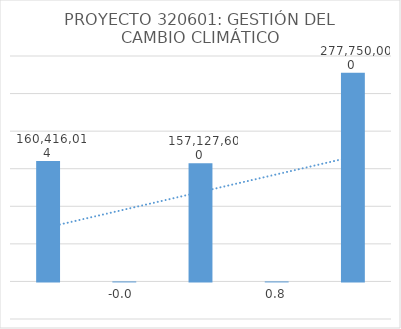
| Category | Series 0 |
|---|---|
| 0 | 160416014 |
| 1 | -0.02 |
| 2 | 157127600 |
| 3 | 0.768 |
| 4 | 277750000 |